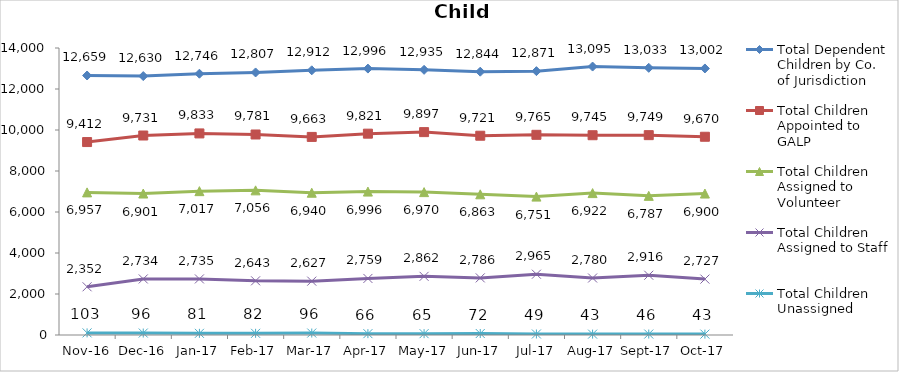
| Category | Total Dependent Children by Co. of Jurisdiction | Total Children Appointed to GALP | Total Children Assigned to Volunteer | Total Children Assigned to Staff | Total Children Unassigned |
|---|---|---|---|---|---|
| 2016-11-01 | 12659 | 9412 | 6957 | 2352 | 103 |
| 2016-12-01 | 12630 | 9731 | 6901 | 2734 | 96 |
| 2017-01-01 | 12746 | 9833 | 7017 | 2735 | 81 |
| 2017-02-01 | 12807 | 9781 | 7056 | 2643 | 82 |
| 2017-03-01 | 12912 | 9663 | 6940 | 2627 | 96 |
| 2017-04-01 | 12996 | 9821 | 6996 | 2759 | 66 |
| 2017-05-01 | 12935 | 9897 | 6970 | 2862 | 65 |
| 2017-06-01 | 12844 | 9721 | 6863 | 2786 | 72 |
| 2017-07-01 | 12871 | 9765 | 6751 | 2965 | 49 |
| 2017-08-01 | 13095 | 9745 | 6922 | 2780 | 43 |
| 2017-09-01 | 13033 | 9749 | 6787 | 2916 | 46 |
| 2017-10-01 | 13002 | 9670 | 6900 | 2727 | 43 |